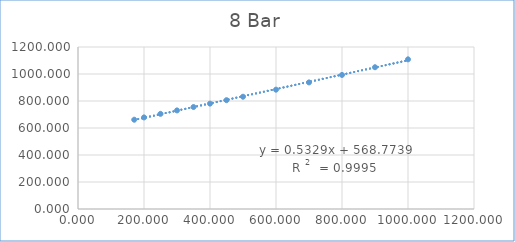
| Category | Series 0 |
|---|---|
| 170.4 | 661.323 |
| 200.0 | 678.38 |
| 250.0 | 704.826 |
| 300.0 | 730.268 |
| 350.0 | 755.423 |
| 400.0 | 780.602 |
| 450.0 | 805.996 |
| 500.0 | 831.653 |
| 600.0 | 883.923 |
| 700.0 | 937.721 |
| 800.0 | 993.072 |
| 900.0 | 1050.048 |
| 1000.0 | 1108.576 |